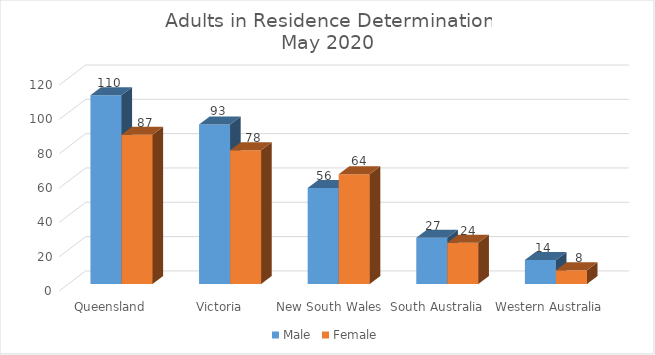
| Category | Male | Female |
|---|---|---|
| Queensland  | 110 | 87 |
| Victoria  | 93 | 78 |
| New South Wales  | 56 | 64 |
| South Australia  | 27 | 24 |
| Western Australia  | 14 | 8 |